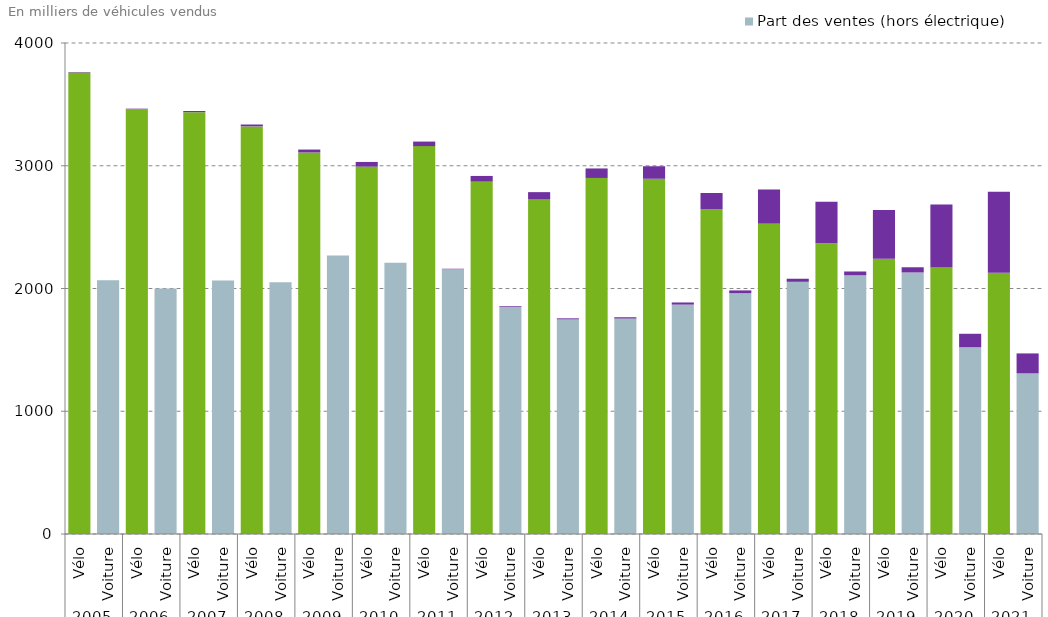
| Category | Part des ventes (hors électrique) | Part des ventes en énergie électrique |
|---|---|---|
| 0 | 3760.1 | 3.9 |
| 1 | 2067.783 | 0.006 |
| 2 | 3459 | 6 |
| 3 | 2000.535 | 0.014 |
| 4 | 3436.3 | 9.7 |
| 5 | 2064.537 | 0.006 |
| 6 | 3320.7 | 15.3 |
| 7 | 2050.279 | 0.004 |
| 8 | 3108.3 | 23.7 |
| 9 | 2268.999 | 0.012 |
| 10 | 2993 | 38 |
| 11 | 2209.812 | 0.187 |
| 12 | 3160 | 37 |
| 13 | 2158.298 | 2.63 |
| 14 | 2870.9 | 46.1 |
| 15 | 1851.352 | 5.661 |
| 16 | 2728.4 | 56.6 |
| 17 | 1748.17 | 8.781 |
| 18 | 2900.5 | 77.5 |
| 19 | 1755.288 | 10.567 |
| 20 | 2894 | 102 |
| 21 | 1868.96 | 17.269 |
| 22 | 2644.111 | 134 |
| 23 | 1962.713 | 21.758 |
| 24 | 2528.577 | 278 |
| 25 | 2054.605 | 24.91 |
| 26 | 2368.573 | 338.1 |
| 27 | 2107.655 | 30.945 |
| 28 | 2242.261 | 398 |
| 29 | 2130.705 | 42.262 |
| 30 | 2170.128 | 514.672 |
| 31 | 1521.355 | 109.823 |
| 32 | 2129 | 660 |
| 33 | 1308.968 | 162.106 |